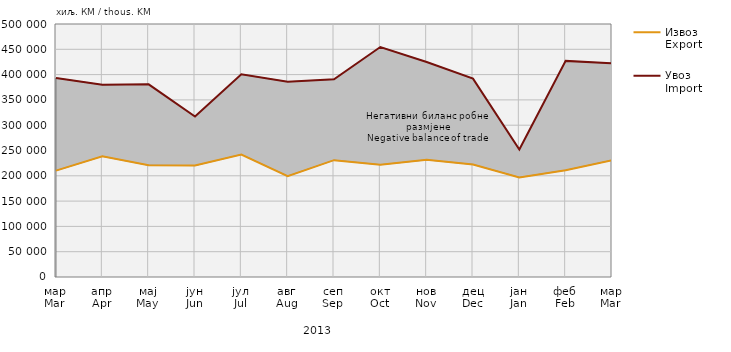
| Category | Извоз
Export | Увоз
Import |
|---|---|---|
| мар
Mar | 210184 | 393365 |
| апр
Apr | 238435 | 379748 |
| мај
May | 220764 | 380770 |
| јун
Jun | 220173 | 317176 |
| јул
Jul | 242098 | 400481 |
| авг
Aug | 199427 | 385911 |
| сеп
Sep | 230912 | 390579 |
| окт
Oct | 221870 | 454480 |
| нов
Nov | 231500 | 424992 |
| дец
Dec | 222497 | 391993 |
| јан
Jan | 196871 | 251909 |
| феб
Feb | 211065 | 427091 |
| мар
Mar | 230811 | 422316 |